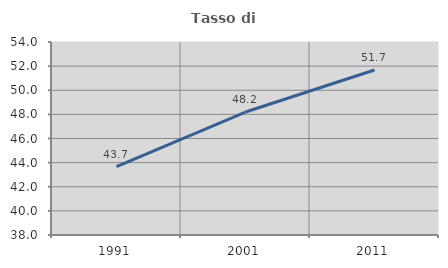
| Category | Tasso di occupazione   |
|---|---|
| 1991.0 | 43.671 |
| 2001.0 | 48.193 |
| 2011.0 | 51.678 |